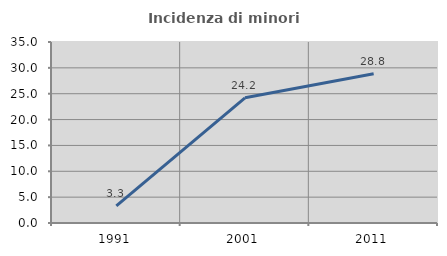
| Category | Incidenza di minori stranieri |
|---|---|
| 1991.0 | 3.306 |
| 2001.0 | 24.206 |
| 2011.0 | 28.846 |